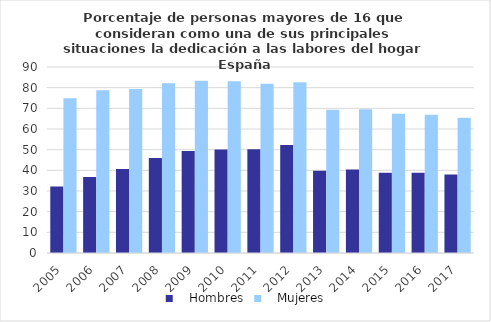
| Category |    Hombres |    Mujeres |
|---|---|---|
| 2005.0 | 32.166 | 74.882 |
| 2006.0 | 36.796 | 78.738 |
| 2007.0 | 40.6 | 79.377 |
| 2008.0 | 45.933 | 82.089 |
| 2009.0 | 49.306 | 83.366 |
| 2010.0 | 50.075 | 83.113 |
| 2011.0 | 50.22 | 81.876 |
| 2012.0 | 52.261 | 82.643 |
| 2013.0 | 39.782 | 69.259 |
| 2014.0 | 40.378 | 69.545 |
| 2015.0 | 38.884 | 67.328 |
| 2016.0 | 38.884 | 66.951 |
| 2017.0 | 38.001 | 65.457 |